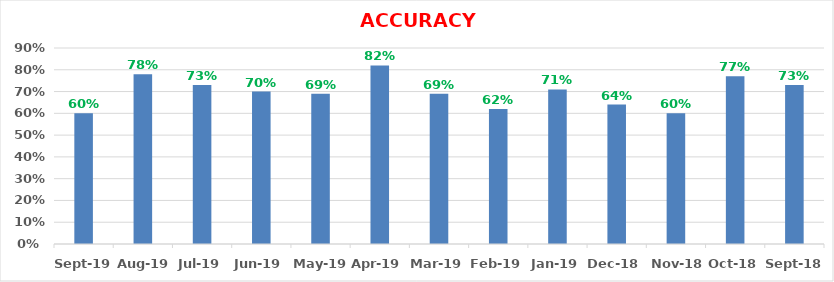
| Category | ACCURACY |
|---|---|
| 2019-09-01 | 0.6 |
| 2019-08-01 | 0.78 |
| 2019-07-01 | 0.73 |
| 2019-06-01 | 0.7 |
| 2019-05-01 | 0.69 |
| 2019-04-01 | 0.82 |
| 2019-03-01 | 0.69 |
| 2019-02-01 | 0.62 |
| 2019-01-01 | 0.71 |
| 2018-12-01 | 0.64 |
| 2018-11-01 | 0.6 |
| 2018-10-01 | 0.77 |
| 2018-09-01 | 0.73 |